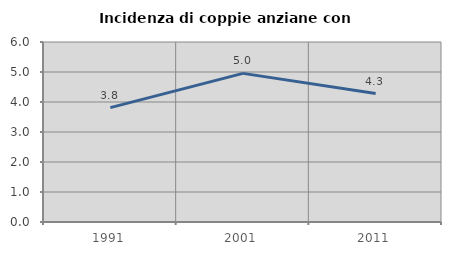
| Category | Incidenza di coppie anziane con figli |
|---|---|
| 1991.0 | 3.814 |
| 2001.0 | 4.954 |
| 2011.0 | 4.281 |